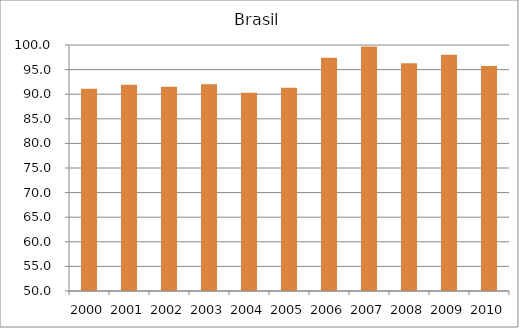
| Category | Brasil |
|---|---|
| 2000.0 | 91.1 |
| 2001.0 | 91.9 |
| 2002.0 | 91.5 |
| 2003.0 | 92 |
| 2004.0 | 90.3 |
| 2005.0 | 91.3 |
| 2006.0 | 97.4 |
| 2007.0 | 99.7 |
| 2008.0 | 96.3 |
| 2009.0 | 98 |
| 2010.0 | 95.73 |